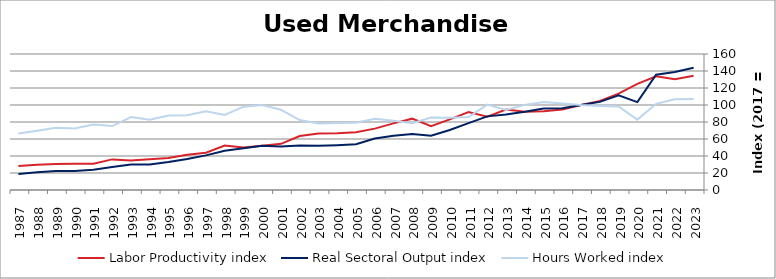
| Category | Labor Productivity index | Real Sectoral Output index | Hours Worked index |
|---|---|---|---|
| 2023.0 | 134.531 | 143.928 | 106.985 |
| 2022.0 | 130.184 | 138.826 | 106.638 |
| 2021.0 | 133.857 | 135.691 | 101.37 |
| 2020.0 | 124.947 | 103.434 | 82.783 |
| 2019.0 | 113.371 | 111.313 | 98.185 |
| 2018.0 | 104.808 | 103.685 | 98.928 |
| 2017.0 | 100 | 100 | 100 |
| 2016.0 | 94.588 | 96.256 | 101.764 |
| 2015.0 | 92.56 | 95.753 | 103.45 |
| 2014.0 | 91.969 | 92.07 | 100.11 |
| 2013.0 | 94.587 | 88.932 | 94.022 |
| 2012.0 | 86.178 | 86.635 | 100.53 |
| 2011.0 | 91.671 | 78.634 | 85.779 |
| 2010.0 | 83.139 | 70.556 | 84.865 |
| 2009.0 | 74.973 | 63.892 | 85.22 |
| 2008.0 | 83.925 | 66.019 | 78.664 |
| 2007.0 | 78.372 | 63.93 | 81.573 |
| 2006.0 | 72.18 | 60.51 | 83.831 |
| 2005.0 | 67.98 | 53.743 | 79.057 |
| 2004.0 | 66.872 | 52.732 | 78.855 |
| 2003.0 | 66.526 | 51.984 | 78.14 |
| 2002.0 | 63.475 | 52.228 | 82.28 |
| 2001.0 | 54.341 | 51.296 | 94.396 |
| 2000.0 | 52.104 | 52.081 | 99.956 |
| 1999.0 | 50.027 | 49.053 | 98.053 |
| 1998.0 | 52.421 | 46.288 | 88.301 |
| 1997.0 | 43.938 | 40.751 | 92.748 |
| 1996.0 | 41.58 | 36.54 | 87.878 |
| 1995.0 | 37.655 | 32.984 | 87.597 |
| 1994.0 | 36.291 | 29.992 | 82.643 |
| 1993.0 | 34.836 | 29.894 | 85.814 |
| 1992.0 | 36.012 | 27.099 | 75.251 |
| 1991.0 | 30.997 | 23.9 | 77.106 |
| 1990.0 | 30.969 | 22.38 | 72.268 |
| 1989.0 | 30.531 | 22.37 | 73.269 |
| 1988.0 | 29.777 | 20.796 | 69.838 |
| 1987.0 | 28.191 | 18.767 | 66.57 |